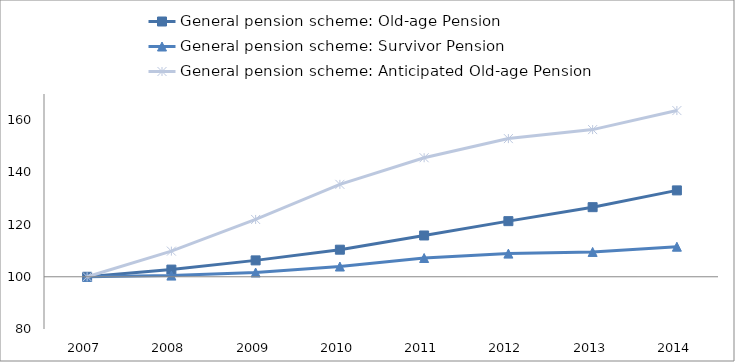
| Category | General pension scheme: Old-age Pension | General pension scheme: Survivor Pension | General pension scheme: Anticipated Old-age Pension |
|---|---|---|---|
| 2007.0 | 100 | 100 | 100 |
| 2008.0 | 102.755 | 100.459 | 109.825 |
| 2009.0 | 106.279 | 101.632 | 121.953 |
| 2010.0 | 110.373 | 103.927 | 135.394 |
| 2011.0 | 115.816 | 107.189 | 145.596 |
| 2012.0 | 121.306 | 108.868 | 152.919 |
| 2013.0 | 126.658 | 109.513 | 156.364 |
| 2014.0 | 133.082 | 111.515 | 163.662 |